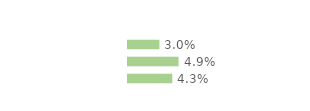
| Category | Series 0 |
|---|---|
| Immigrées | 0.03 |
| Descendantes d'immigré(s) | 0.049 |
| Ni immigrées, ni descendantes | 0.043 |